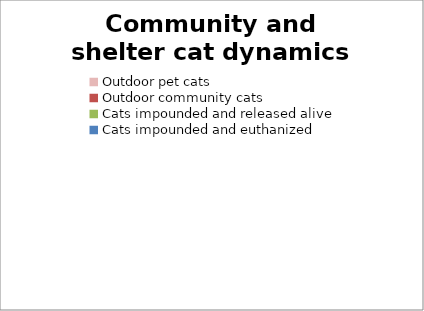
| Category | Series 0 |
|---|---|
| Outdoor pet cats | 0 |
| Outdoor community cats | 0 |
| Cats impounded and released alive | 0 |
| Cats impounded and euthanized | 0 |